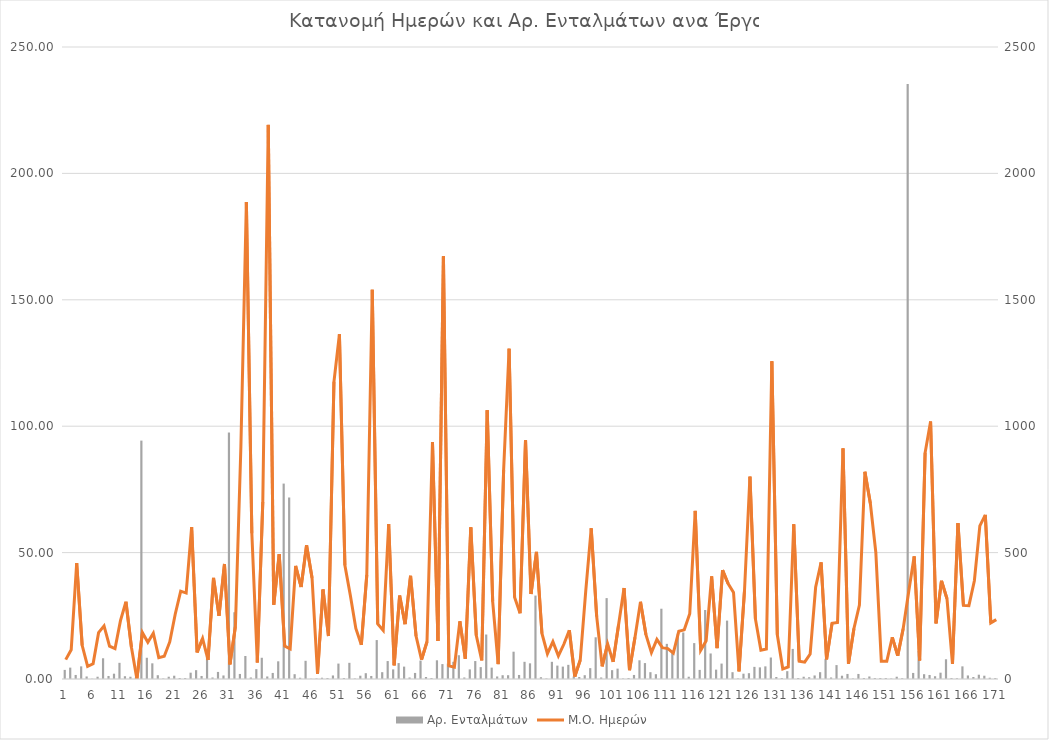
| Category | Αρ. Ενταλμάτων |
|---|---|
| 0 | 36 |
| 1 | 45 |
| 2 | 16 |
| 3 | 50 |
| 4 | 10 |
| 5 | 1 |
| 6 | 9 |
| 7 | 82 |
| 8 | 12 |
| 9 | 21 |
| 10 | 64 |
| 11 | 11 |
| 12 | 9 |
| 13 | 6 |
| 14 | 943 |
| 15 | 84 |
| 16 | 62 |
| 17 | 15 |
| 18 | 2 |
| 19 | 9 |
| 20 | 13 |
| 21 | 4 |
| 22 | 4 |
| 23 | 25 |
| 24 | 35 |
| 25 | 12 |
| 26 | 116 |
| 27 | 6 |
| 28 | 28 |
| 29 | 14 |
| 30 | 975 |
| 31 | 264 |
| 32 | 20 |
| 33 | 91 |
| 34 | 6 |
| 35 | 39 |
| 36 | 84 |
| 37 | 10 |
| 38 | 24 |
| 39 | 70 |
| 40 | 773 |
| 41 | 718 |
| 42 | 19 |
| 43 | 5 |
| 44 | 72 |
| 45 | 1 |
| 46 | 2 |
| 47 | 5 |
| 48 | 4 |
| 49 | 14 |
| 50 | 61 |
| 51 | 4 |
| 52 | 64 |
| 53 | 2 |
| 54 | 13 |
| 55 | 23 |
| 56 | 12 |
| 57 | 154 |
| 58 | 27 |
| 59 | 71 |
| 60 | 38 |
| 61 | 63 |
| 62 | 49 |
| 63 | 6 |
| 64 | 24 |
| 65 | 73 |
| 66 | 8 |
| 67 | 4 |
| 68 | 74 |
| 69 | 59 |
| 70 | 61 |
| 71 | 68 |
| 72 | 94 |
| 73 | 6 |
| 74 | 38 |
| 75 | 71 |
| 76 | 47 |
| 77 | 176 |
| 78 | 45 |
| 79 | 10 |
| 80 | 15 |
| 81 | 15 |
| 82 | 108 |
| 83 | 16 |
| 84 | 68 |
| 85 | 62 |
| 86 | 330 |
| 87 | 7 |
| 88 | 2 |
| 89 | 68 |
| 90 | 53 |
| 91 | 49 |
| 92 | 56 |
| 93 | 10 |
| 94 | 8 |
| 95 | 15 |
| 96 | 43 |
| 97 | 165 |
| 98 | 6 |
| 99 | 320 |
| 100 | 35 |
| 101 | 41 |
| 102 | 2 |
| 103 | 4 |
| 104 | 16 |
| 105 | 74 |
| 106 | 63 |
| 107 | 27 |
| 108 | 19 |
| 109 | 278 |
| 110 | 139 |
| 111 | 112 |
| 112 | 179 |
| 113 | 184 |
| 114 | 9 |
| 115 | 142 |
| 116 | 36 |
| 117 | 273 |
| 118 | 101 |
| 119 | 37 |
| 120 | 61 |
| 121 | 231 |
| 122 | 27 |
| 123 | 2 |
| 124 | 21 |
| 125 | 23 |
| 126 | 48 |
| 127 | 46 |
| 128 | 50 |
| 129 | 85 |
| 130 | 8 |
| 131 | 4 |
| 132 | 31 |
| 133 | 119 |
| 134 | 4 |
| 135 | 9 |
| 136 | 7 |
| 137 | 14 |
| 138 | 27 |
| 139 | 80 |
| 140 | 6 |
| 141 | 55 |
| 142 | 13 |
| 143 | 20 |
| 144 | 2 |
| 145 | 20 |
| 146 | 4 |
| 147 | 10 |
| 148 | 4 |
| 149 | 4 |
| 150 | 4 |
| 151 | 2 |
| 152 | 9 |
| 153 | 3 |
| 154 | 2354 |
| 155 | 24 |
| 156 | 111 |
| 157 | 19 |
| 158 | 16 |
| 159 | 11 |
| 160 | 25 |
| 161 | 78 |
| 162 | 4 |
| 163 | 3 |
| 164 | 50 |
| 165 | 14 |
| 166 | 8 |
| 167 | 17 |
| 168 | 13 |
| 169 | 5 |
| 170 | 4 |